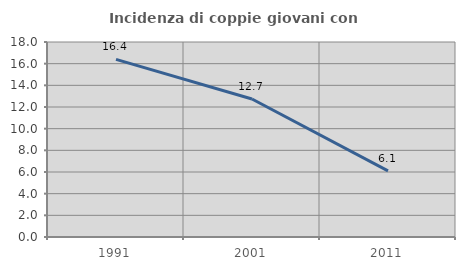
| Category | Incidenza di coppie giovani con figli |
|---|---|
| 1991.0 | 16.393 |
| 2001.0 | 12.741 |
| 2011.0 | 6.107 |